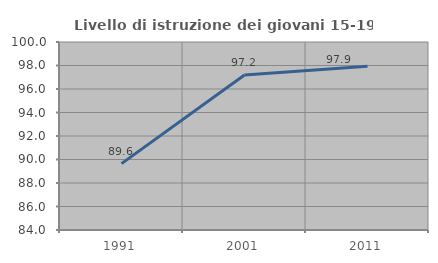
| Category | Livello di istruzione dei giovani 15-19 anni |
|---|---|
| 1991.0 | 89.649 |
| 2001.0 | 97.199 |
| 2011.0 | 97.943 |